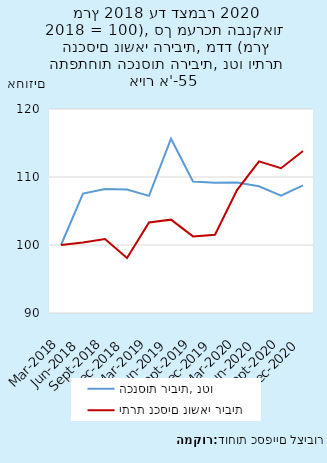
| Category | הכנסות ריבית, נטו | יתרת נכסים נושאי ריבית |
|---|---|---|
| 2018-03-31 | 100 | 100 |
| 2018-06-30 | 107.561 | 100.356 |
| 2018-09-30 | 108.218 | 100.865 |
| 2018-12-31 | 108.154 | 98.074 |
| 2019-03-31 | 107.221 | 103.303 |
| 2019-06-30 | 115.623 | 103.729 |
| 2019-09-30 | 109.341 | 101.265 |
| 2019-12-31 | 109.16 | 101.516 |
| 2020-03-31 | 109.189 | 108.068 |
| 2020-06-30 | 108.64 | 112.31 |
| 2020-09-30 | 107.266 | 111.289 |
| 2020-12-31 | 108.759 | 113.823 |